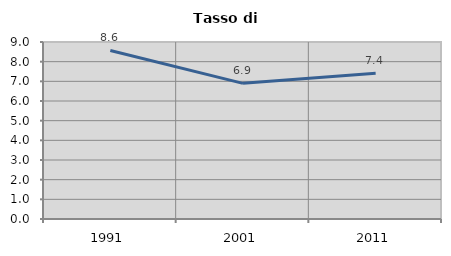
| Category | Tasso di disoccupazione   |
|---|---|
| 1991.0 | 8.571 |
| 2001.0 | 6.897 |
| 2011.0 | 7.407 |